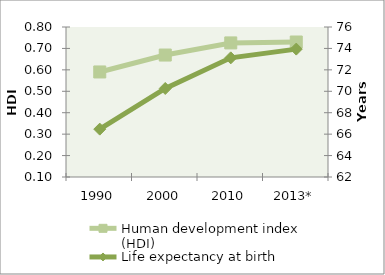
| Category | Human development index (HDI) |
|---|---|
| 1990 | 0.59 |
| 2000 | 0.669 |
| 2010 | 0.726 |
| 2013* | 0.73 |